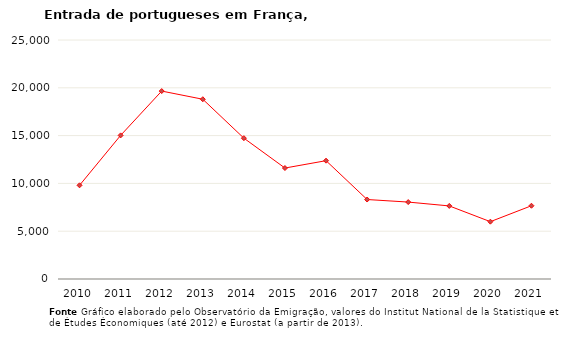
| Category | Entradas |
|---|---|
| 2010.0 | 9801 |
| 2011.0 | 15023 |
| 2012.0 | 19658 |
| 2013.0 | 18803 |
| 2014.0 | 14732 |
| 2015.0 | 11607 |
| 2016.0 | 12377 |
| 2017.0 | 8314 |
| 2018.0 | 8047 |
| 2019.0 | 7643 |
| 2020.0 | 5998 |
| 2021.0 | 7663 |